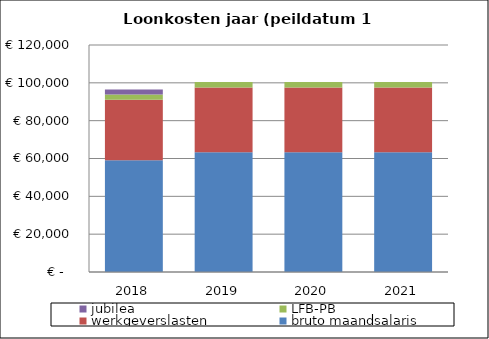
| Category | bruto maandsalaris | werkgeverslasten | LFB-PB | jubilea |
|---|---|---|---|---|
| 2018.0 | 59124 | 31926.96 | 2744.152 | 2660.58 |
| 2019.0 | 63348 | 34207.92 | 2940.203 | 0 |
| 2020.0 | 63348 | 34207.92 | 2940.203 | 0 |
| 2021.0 | 63348 | 34207.92 | 2940.203 | 0 |